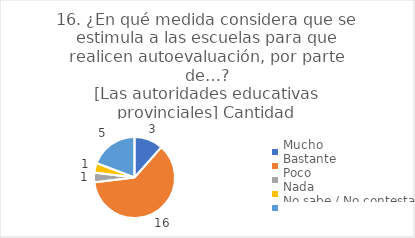
| Category | 16. ¿En qué medida considera que se estimula a las escuelas para que realicen autoevaluación, por parte de…?
[Las autoridades educativas provinciales] |
|---|---|
| Mucho  | 0.115 |
| Bastante  | 0.615 |
| Poco  | 0.038 |
| Nada  | 0.038 |
| No sabe / No contesta | 0.192 |